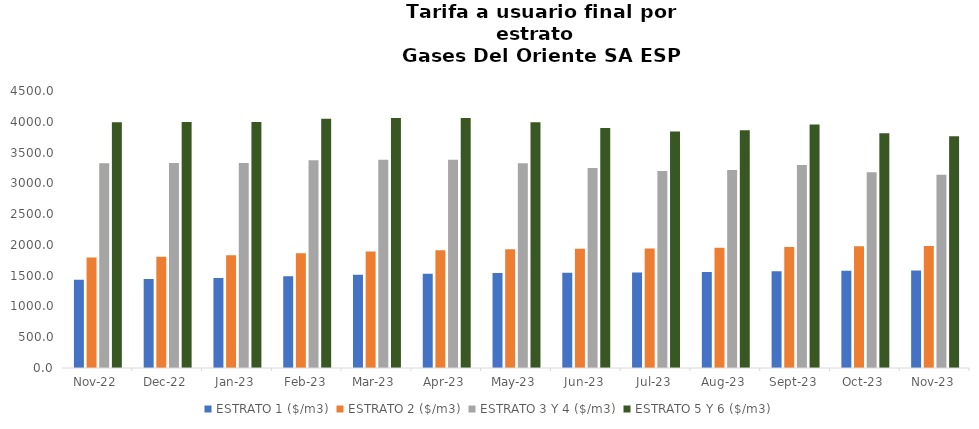
| Category | ESTRATO 1 ($/m3) | ESTRATO 2 ($/m3) | ESTRATO 3 Y 4 ($/m3) | ESTRATO 5 Y 6 ($/m3) |
|---|---|---|---|---|
| 2022-11-01 | 1433.79 | 1794.38 | 3327.1 | 3992.52 |
| 2022-12-01 | 1444.79 | 1808.19 | 3331.66 | 3997.992 |
| 2023-01-01 | 1462.96 | 1831 | 3330.8 | 3996.96 |
| 2023-02-01 | 1488.96 | 1863.54 | 3374.22 | 4049.064 |
| 2023-03-01 | 1513.69 | 1894.49 | 3383.42 | 4060.104 |
| 2023-04-01 | 1529.59 | 1914.39 | 3383.42 | 4060.104 |
| 2023-05-01 | 1541.54 | 1929.36 | 3326.59 | 3991.908 |
| 2023-06-01 | 1548.28 | 1937.78 | 3250.2 | 3900.24 |
| 2023-07-01 | 1551.99 | 1942.43 | 3200.63 | 3840.756 |
| 2023-08-01 | 1560.7 | 1953.33 | 3217.02 | 3860.424 |
| 2023-09-01 | 1571.61 | 1966.99 | 3297.13 | 3956.556 |
| 2023-10-01 | 1579.97 | 1977.45 | 3179.1 | 3814.92 |
| 2023-11-01 | 1583.91 | 1982.39 | 3137.6 | 3765.12 |